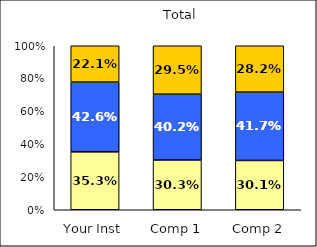
| Category | Low Pluralistic Orientation | Average Pluralistic Orientation | High Pluralistic Orientation |
|---|---|---|---|
| Your Inst | 0.353 | 0.426 | 0.221 |
| Comp 1 | 0.303 | 0.402 | 0.295 |
| Comp 2 | 0.301 | 0.417 | 0.282 |